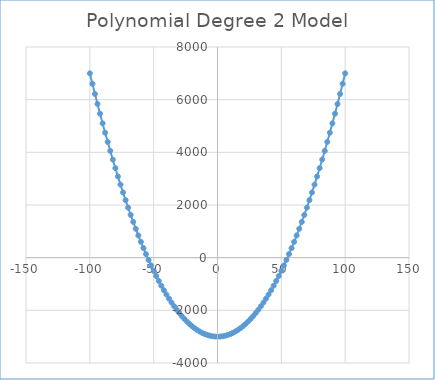
| Category | Series 0 |
|---|---|
| -100.0 | 7000 |
| -98.0 | 6604 |
| -96.0 | 6216 |
| -94.0 | 5836 |
| -92.0 | 5464 |
| -90.0 | 5100 |
| -88.0 | 4744 |
| -86.0 | 4396 |
| -84.0 | 4056 |
| -82.0 | 3724 |
| -80.0 | 3400 |
| -78.0 | 3084 |
| -76.0 | 2776 |
| -74.0 | 2476 |
| -72.0 | 2184 |
| -70.0 | 1900 |
| -68.0 | 1624 |
| -66.0 | 1356 |
| -64.0 | 1096 |
| -62.0 | 844 |
| -60.0 | 600 |
| -58.0 | 364 |
| -56.0 | 136 |
| -54.0 | -84 |
| -52.0 | -296 |
| -50.0 | -500 |
| -48.0 | -696 |
| -46.0 | -884 |
| -44.0 | -1064 |
| -42.0 | -1236 |
| -40.0 | -1400 |
| -38.0 | -1556 |
| -36.0 | -1704 |
| -34.0 | -1844 |
| -32.0 | -1976 |
| -30.0 | -2100 |
| -28.0 | -2216 |
| -26.0 | -2324 |
| -24.0 | -2424 |
| -22.0 | -2516 |
| -20.0 | -2600 |
| -18.0 | -2676 |
| -16.0 | -2744 |
| -14.0 | -2804 |
| -12.0 | -2856 |
| -10.0 | -2900 |
| -8.0 | -2936 |
| -6.0 | -2964 |
| -4.0 | -2984 |
| -2.0 | -2996 |
| 0.0 | -3000 |
| 2.0 | -2996 |
| 4.0 | -2984 |
| 6.0 | -2964 |
| 8.0 | -2936 |
| 10.0 | -2900 |
| 12.0 | -2856 |
| 14.0 | -2804 |
| 16.0 | -2744 |
| 18.0 | -2676 |
| 20.0 | -2600 |
| 22.0 | -2516 |
| 24.0 | -2424 |
| 26.0 | -2324 |
| 28.0 | -2216 |
| 30.0 | -2100 |
| 32.0 | -1976 |
| 34.0 | -1844 |
| 36.0 | -1704 |
| 38.0 | -1556 |
| 40.0 | -1400 |
| 42.0 | -1236 |
| 44.0 | -1064 |
| 46.0 | -884 |
| 48.0 | -696 |
| 50.0 | -500 |
| 52.0 | -296 |
| 54.0 | -84 |
| 56.0 | 136 |
| 58.0 | 364 |
| 60.0 | 600 |
| 62.0 | 844 |
| 64.0 | 1096 |
| 66.0 | 1356 |
| 68.0 | 1624 |
| 70.0 | 1900 |
| 72.0 | 2184 |
| 74.0 | 2476 |
| 76.0 | 2776 |
| 78.0 | 3084 |
| 80.0 | 3400 |
| 82.0 | 3724 |
| 84.0 | 4056 |
| 86.0 | 4396 |
| 88.0 | 4744 |
| 90.0 | 5100 |
| 92.0 | 5464 |
| 94.0 | 5836 |
| 96.0 | 6216 |
| 98.0 | 6604 |
| 100.0 | 7000 |